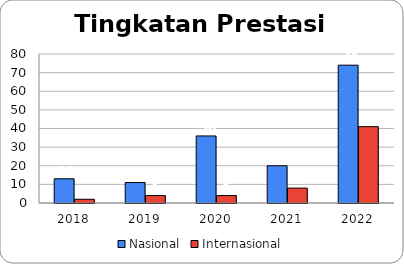
| Category | Nasional | Internasional |
|---|---|---|
| 2018.0 | 13 | 2 |
| 2019.0 | 11 | 4 |
| 2020.0 | 36 | 4 |
| 2021.0 | 20 | 8 |
| 2022.0 | 74 | 41 |